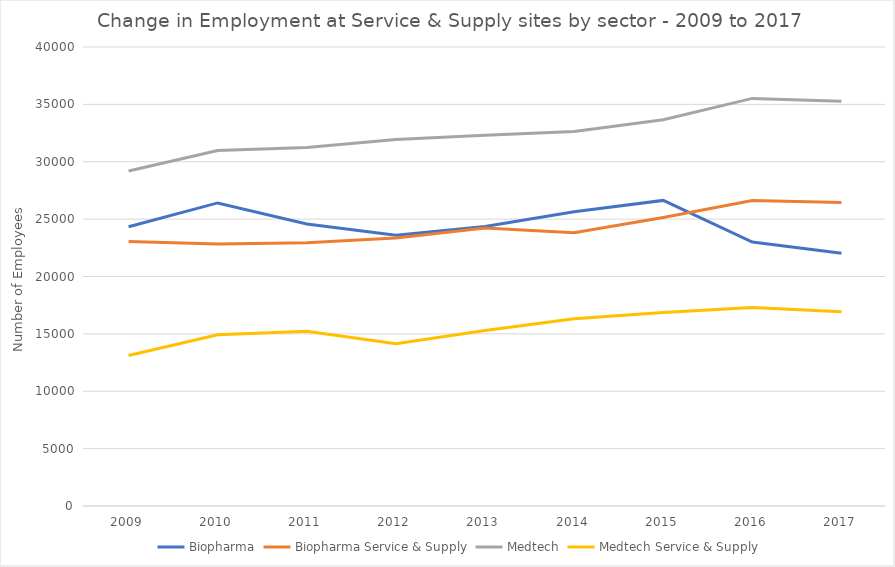
| Category | Biopharma | Biopharma Service & Supply | Medtech | Medtech Service & Supply |
|---|---|---|---|---|
| 2009 | 24338 | 23046 | 29188 | 13116 |
| 2010 | 26412 | 22840 | 30971 | 14924 |
| 2011 | 24569 | 22934 | 31248 | 15229 |
| 2012 | 23600 | 23356 | 31946 | 14144 |
| 2013 | 24366 | 24236 | 32301 | 15299 |
| 2014 | 25637 | 23805 | 32640 | 16323 |
| 2015 | 26632 | 25138 | 33662 | 16863 |
| 2016 | 22997 | 26630 | 35520 | 17299 |
| 2017 | 22021 | 26459 | 35269 | 16931 |